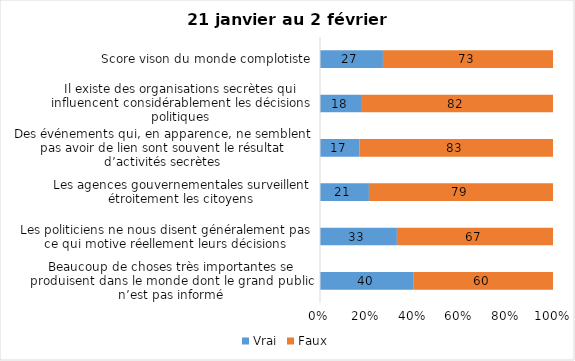
| Category | Vrai | Faux |
|---|---|---|
| Beaucoup de choses très importantes se produisent dans le monde dont le grand public n’est pas informé | 40 | 60 |
| Les politiciens ne nous disent généralement pas ce qui motive réellement leurs décisions | 33 | 67 |
| Les agences gouvernementales surveillent étroitement les citoyens | 21 | 79 |
| Des événements qui, en apparence, ne semblent pas avoir de lien sont souvent le résultat d’activités secrètes | 17 | 83 |
| Il existe des organisations secrètes qui influencent considérablement les décisions politiques | 18 | 82 |
| Score vison du monde complotiste | 27 | 73 |